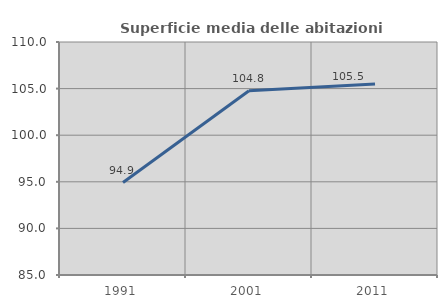
| Category | Superficie media delle abitazioni occupate |
|---|---|
| 1991.0 | 94.924 |
| 2001.0 | 104.773 |
| 2011.0 | 105.487 |